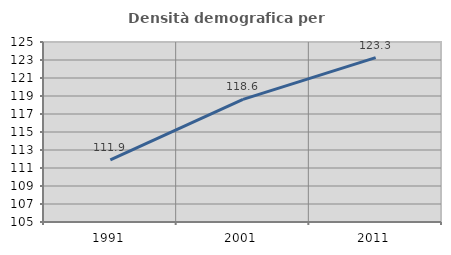
| Category | Densità demografica |
|---|---|
| 1991.0 | 111.908 |
| 2001.0 | 118.624 |
| 2011.0 | 123.267 |